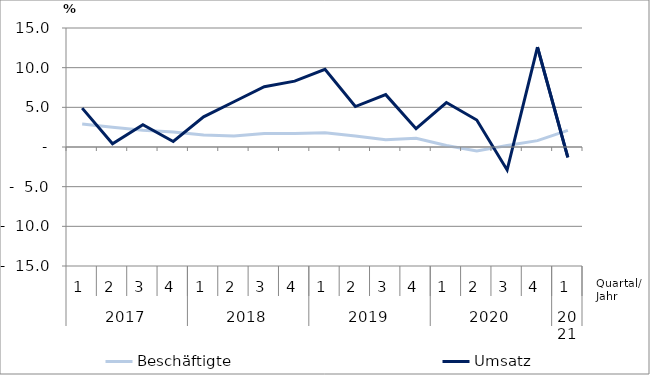
| Category | Beschäftigte | Umsatz |
|---|---|---|
| 0 | 2.9 | 4.9 |
| 1 | 2.5 | 0.4 |
| 2 | 2.1 | 2.8 |
| 3 | 1.9 | 0.7 |
| 4 | 1.5 | 3.8 |
| 5 | 1.4 | 5.7 |
| 6 | 1.7 | 7.6 |
| 7 | 1.7 | 8.3 |
| 8 | 1.8 | 9.8 |
| 9 | 1.4 | 5.1 |
| 10 | 0.9 | 6.6 |
| 11 | 1.1 | 2.3 |
| 12 | 0.2 | 5.6 |
| 13 | -0.5 | 3.4 |
| 14 | 0.2 | -2.9 |
| 15 | 0.8 | 12.6 |
| 16 | 2.1 | -1.3 |